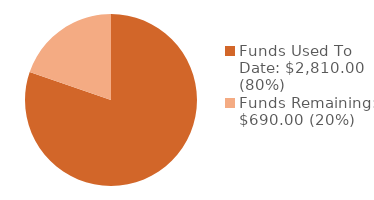
| Category | Series 0 |
|---|---|
| Funds Used To Date: $2,810.00 (80%) | 2810 |
| Funds Remaining: $690.00 (20%) | 690 |